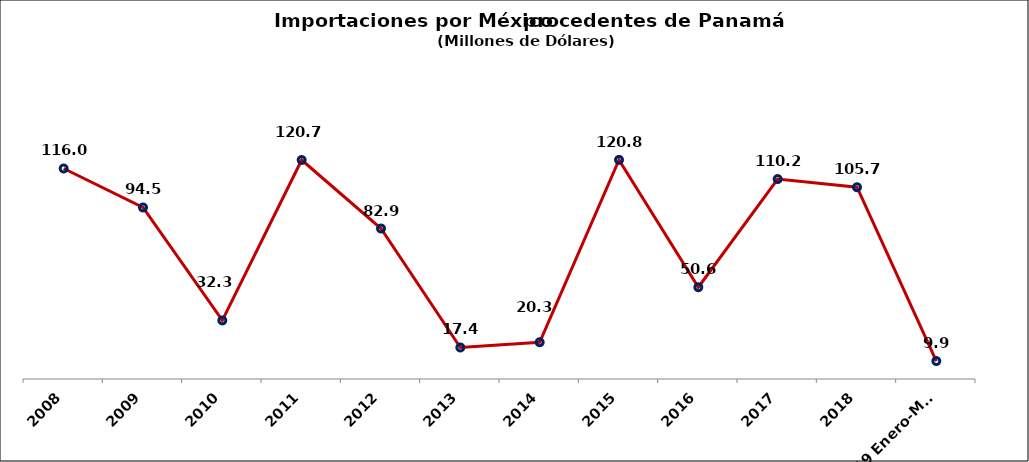
| Category | Series 0 |
|---|---|
| 2008 | 116.03 |
| 2009 | 94.53 |
| 2010 | 32.275 |
| 2011 | 120.712 |
| 2012 | 82.948 |
| 2013 | 17.37 |
| 2014 | 20.27 |
| 2015 | 120.782 |
| 2016 | 50.58 |
| 2017 | 110.2 |
| 2018 | 105.7 |
| 2019 Enero-Mayo | 9.9 |